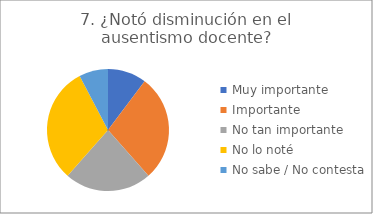
| Category | 7. ¿Notó disminución en el ausentismo docente? | 2. ¿Notó disminución de las llegadas tarde de los niños? |
|---|---|---|
| Muy importante  | 0.103 | 0.231 |
| Importante  | 0.282 | 0.282 |
| No tan importante  | 0.231 | 0.385 |
| No lo noté  | 0.308 | 0.051 |
| No sabe / No contesta | 0.077 | 0.051 |